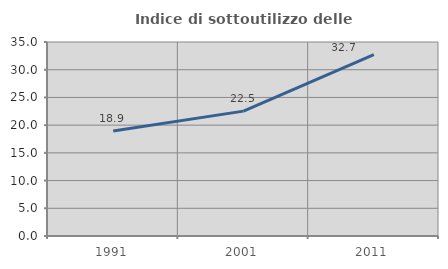
| Category | Indice di sottoutilizzo delle abitazioni  |
|---|---|
| 1991.0 | 18.927 |
| 2001.0 | 22.527 |
| 2011.0 | 32.731 |